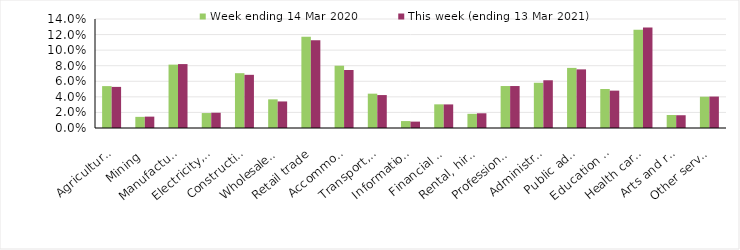
| Category | Week ending 14 Mar 2020 | This week (ending 13 Mar 2021) |
|---|---|---|
| Agriculture, forestry and fishing | 0.054 | 0.053 |
| Mining | 0.014 | 0.015 |
| Manufacturing | 0.081 | 0.082 |
| Electricity, gas, water and waste services | 0.019 | 0.02 |
| Construction | 0.07 | 0.068 |
| Wholesale trade | 0.037 | 0.034 |
| Retail trade | 0.117 | 0.113 |
| Accommodation and food services | 0.08 | 0.074 |
| Transport, postal and warehousing | 0.044 | 0.042 |
| Information media and telecommunications | 0.009 | 0.008 |
| Financial and insurance services | 0.03 | 0.03 |
| Rental, hiring and real estate services | 0.018 | 0.019 |
| Professional, scientific and technical services | 0.054 | 0.054 |
| Administrative and support services | 0.058 | 0.061 |
| Public administration and safety | 0.077 | 0.075 |
| Education and training | 0.05 | 0.048 |
| Health care and social assistance | 0.126 | 0.129 |
| Arts and recreation services | 0.017 | 0.016 |
| Other services | 0.04 | 0.04 |